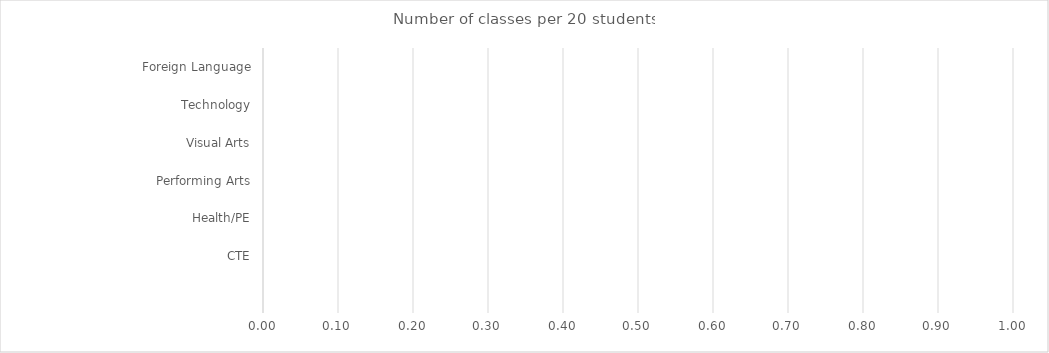
| Category | Benchmark | Entire LEA  | Title IV-A Identified Schools |
|---|---|---|---|
| Foreign Language | 0 | 0 | 0 |
| Technology | 0 | 0 | 0 |
| Visual Arts | 0 | 0 | 0 |
| Performing Arts | 0 | 0 | 0 |
| Health/PE | 0 | 0 | 0 |
| CTE | 0 | 0 | 0 |